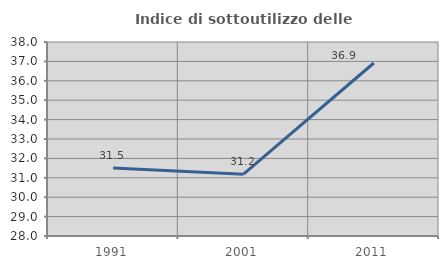
| Category | Indice di sottoutilizzo delle abitazioni  |
|---|---|
| 1991.0 | 31.507 |
| 2001.0 | 31.186 |
| 2011.0 | 36.918 |